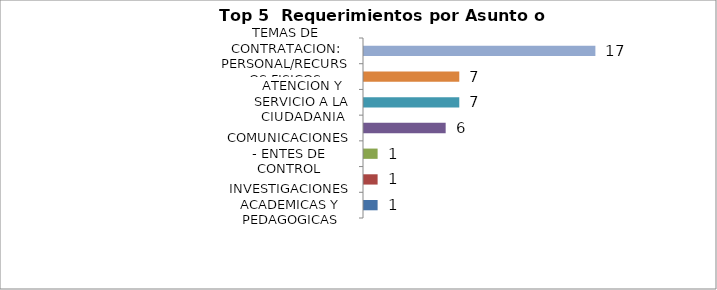
| Category | Total |
|---|---|
| INVESTIGACIONES ACADEMICAS Y PEDAGOGICAS | 1 |
| POLITICAS DE LA ENTIDAD | 1 |
| COMUNICACIONES - ENTES DE CONTROL | 1 |
| TRASLADO POR NO COMPETENCIA | 6 |
| ATENCION Y SERVICIO A LA CIUDADANIA | 7 |
| TEMAS ADMINISTRATIVOS Y FINANCIEROS | 7 |
| TEMAS DE CONTRATACION: PERSONAL/RECURSOS FISICOS | 17 |